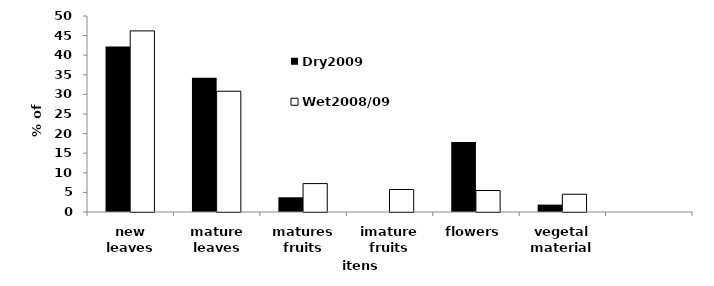
| Category | Dry2009 | Wet2008/09 |
|---|---|---|
| new leaves | 42.25 | 46.2 |
| mature leaves | 34.27 | 30.8 |
| matures fruits | 3.76 | 7.25 |
| imature fruits | 0 | 5.74 |
| flowers | 17.84 | 5.48 |
| vegetal material | 1.88 | 4.53 |